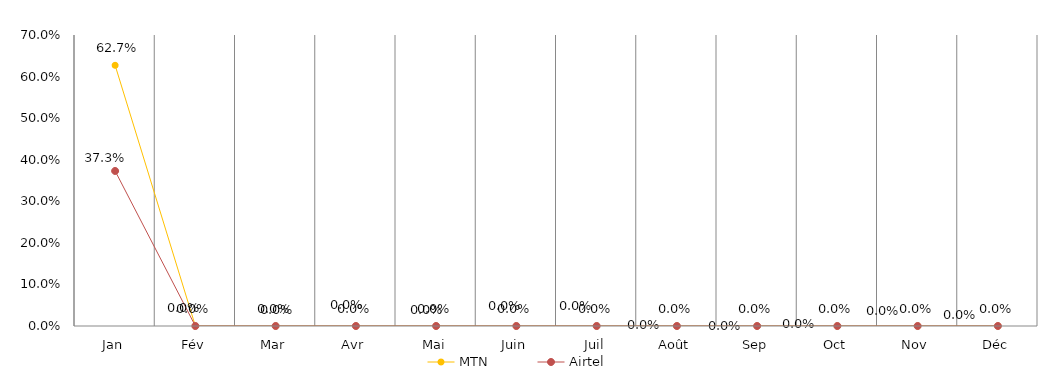
| Category | MTN | Airtel |
|---|---|---|
| Jan | 0.627 | 0.373 |
| Fév | 0 | 0 |
| Mar | 0 | 0 |
| Avr | 0 | 0 |
| Mai | 0 | 0 |
| Juin | 0 | 0 |
| Juil | 0 | 0 |
| Août | 0 | 0 |
| Sep | 0 | 0 |
| Oct | 0 | 0 |
| Nov | 0 | 0 |
| Déc | 0 | 0 |